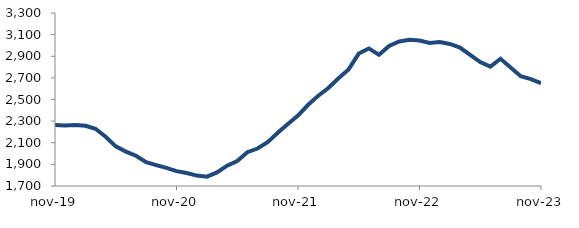
| Category | Series 0 |
|---|---|
| 2019-11-01 | 2263.898 |
| 2019-12-01 | 2259.926 |
| 2020-01-01 | 2265.053 |
| 2020-02-01 | 2256.766 |
| 2020-03-01 | 2229.161 |
| 2020-04-01 | 2155.791 |
| 2020-05-01 | 2066.843 |
| 2020-06-01 | 2018.026 |
| 2020-07-01 | 1979.558 |
| 2020-08-01 | 1920.368 |
| 2020-09-01 | 1893.237 |
| 2020-10-01 | 1867.4 |
| 2020-11-01 | 1837.195 |
| 2020-12-01 | 1819.546 |
| 2021-01-01 | 1796.45 |
| 2021-02-01 | 1786.603 |
| 2021-03-01 | 1826.072 |
| 2021-04-01 | 1887.798 |
| 2021-05-01 | 1930.372 |
| 2021-06-01 | 2012.926 |
| 2021-07-01 | 2046.434 |
| 2021-08-01 | 2105.806 |
| 2021-09-01 | 2192.514 |
| 2021-10-01 | 2272.972 |
| 2021-11-01 | 2351.334 |
| 2021-12-01 | 2451.171 |
| 2022-01-01 | 2534.613 |
| 2022-02-01 | 2606.357 |
| 2022-03-01 | 2696.948 |
| 2022-04-01 | 2778.264 |
| 2022-05-01 | 2924.682 |
| 2022-06-01 | 2972.281 |
| 2022-07-01 | 2912.933 |
| 2022-08-01 | 2994.913 |
| 2022-09-01 | 3036.467 |
| 2022-10-01 | 3052.236 |
| 2022-11-01 | 3044.767 |
| 2022-12-01 | 3023.141 |
| 2023-01-01 | 3030.956 |
| 2023-02-01 | 3013.674 |
| 2023-03-01 | 2979.861 |
| 2023-04-01 | 2913.014 |
| 2023-05-01 | 2845.832 |
| 2023-06-01 | 2803.594 |
| 2023-07-01 | 2876.7 |
| 2023-08-01 | 2796.297 |
| 2023-09-01 | 2715.691 |
| 2023-10-01 | 2689.066 |
| 2023-11-01 | 2650.837 |